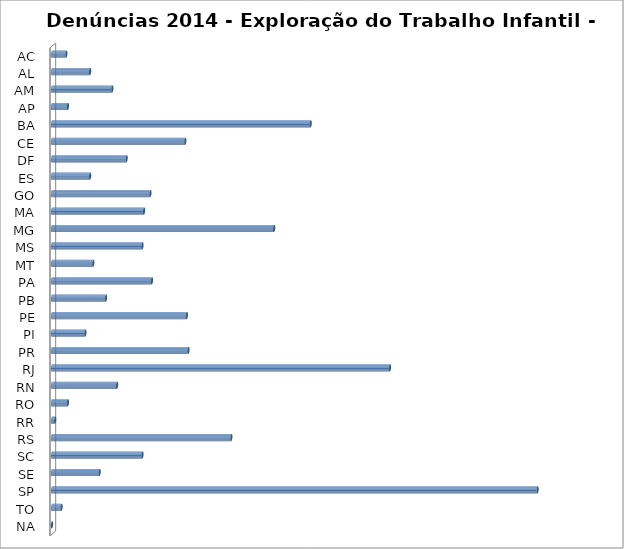
| Category | Series 0 |
|---|---|
| AC | 9 |
| AL | 24 |
| AM | 38 |
| AP | 10 |
| BA | 163 |
| CE | 84 |
| DF | 47 |
| ES | 24 |
| GO | 62 |
| MA | 58 |
| MG | 140 |
| MS | 57 |
| MT | 26 |
| PA | 63 |
| PB | 34 |
| PE | 85 |
| PI | 21 |
| PR | 86 |
| RJ | 213 |
| RN | 41 |
| RO | 10 |
| RR | 2 |
| RS | 113 |
| SC | 57 |
| SE | 30 |
| SP | 306 |
| TO | 6 |
| NA | 0 |